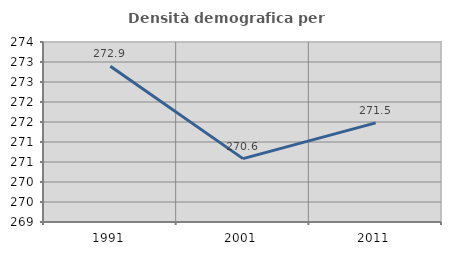
| Category | Densità demografica |
|---|---|
| 1991.0 | 272.895 |
| 2001.0 | 270.584 |
| 2011.0 | 271.479 |